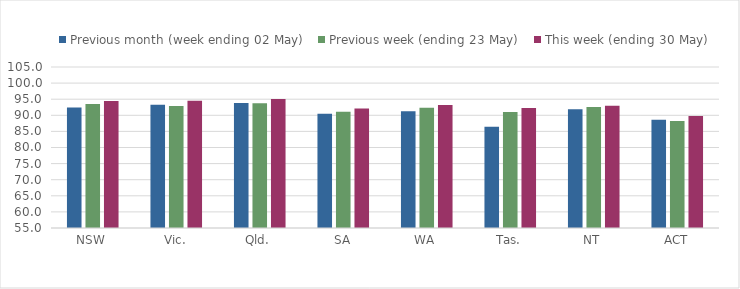
| Category | Previous month (week ending 02 May) | Previous week (ending 23 May) | This week (ending 30 May) |
|---|---|---|---|
| NSW | 92.415 | 93.48 | 94.441 |
| Vic. | 93.244 | 92.925 | 94.55 |
| Qld. | 93.805 | 93.755 | 95.042 |
| SA | 90.45 | 91.114 | 92.124 |
| WA | 91.249 | 92.314 | 93.208 |
| Tas. | 86.448 | 90.999 | 92.277 |
| NT | 91.849 | 92.576 | 92.943 |
| ACT | 88.627 | 88.235 | 89.8 |